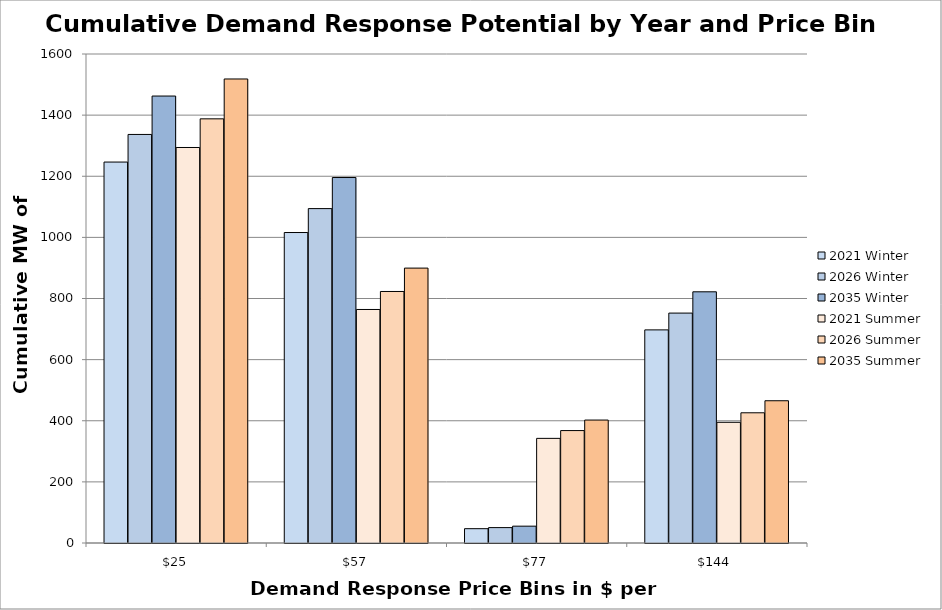
| Category | 2021 Winter | 2026 Winter | 2035 Winter | 2021 Summer | 2026 Summer | 2035 Summer |
|---|---|---|---|---|---|---|
| 24.607453662383513 | 1246.455 | 1336.791 | 1462.424 | 1294.07 | 1387.857 | 1518.289 |
| 56.55462571732847 | 1015.86 | 1094.139 | 1195.832 | 764.109 | 822.989 | 899.48 |
| 77.2021787341996 | 46.872 | 50.361 | 55.072 | 342.375 | 367.859 | 402.267 |
| 144.22396574738113 | 697.314 | 752.285 | 821.905 | 394.893 | 426.024 | 465.45 |